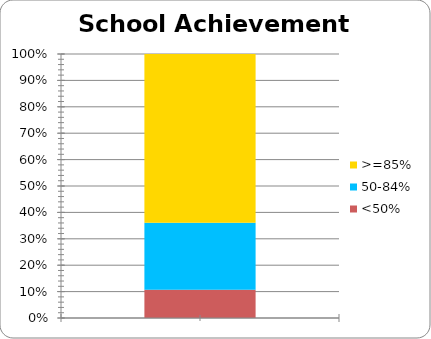
| Category | <50% | 50-84% | >=85% |
|---|---|---|---|
|  | 269 | 641 | 1613 |